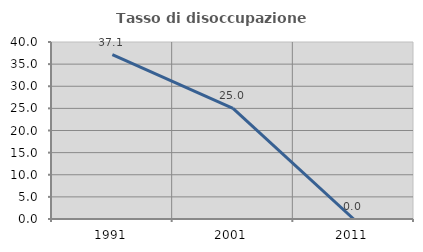
| Category | Tasso di disoccupazione giovanile  |
|---|---|
| 1991.0 | 37.143 |
| 2001.0 | 25 |
| 2011.0 | 0 |